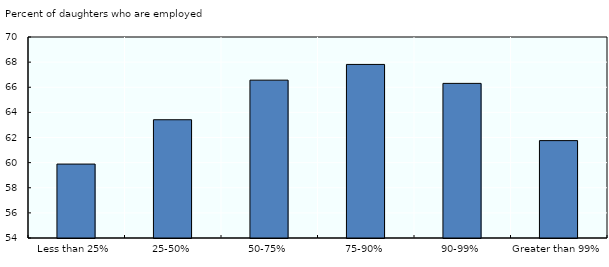
| Category | Percent of daughters who are employed |
|---|---|
| Less than 25% | 59.885 |
| 25-50% | 63.413 |
| 50-75% | 66.565 |
| 75-90% | 67.817 |
| 90-99% | 66.308 |
| Greater than 99% | 61.752 |